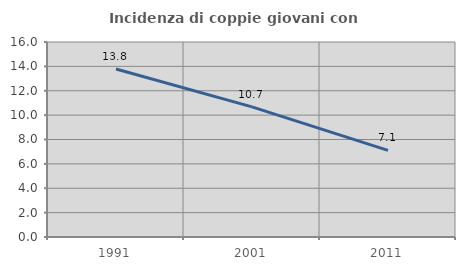
| Category | Incidenza di coppie giovani con figli |
|---|---|
| 1991.0 | 13.79 |
| 2001.0 | 10.675 |
| 2011.0 | 7.112 |